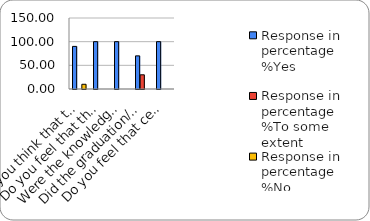
| Category | Response in percentage  |
|---|---|
| Do you think that the curriculum which you had during your graduation/post graduation has provided you with the knowledge & skills necessary to get employed/Self-employed or start own business? | 10 |
| Do you feel that the curriculum you studied is helpful in progression to higher studies? | 0 |
| Were the knowledge & skills acquired through the curriculum useful to you while working on the job?   | 0 |
| Did the graduation/post-graduation programme bring about any attitudinal and behavioural change in you? | 0 |
| Do you feel that certificate/ diploma courses offered by the college in addition to the curriculum lead to better career prospects? | 0 |